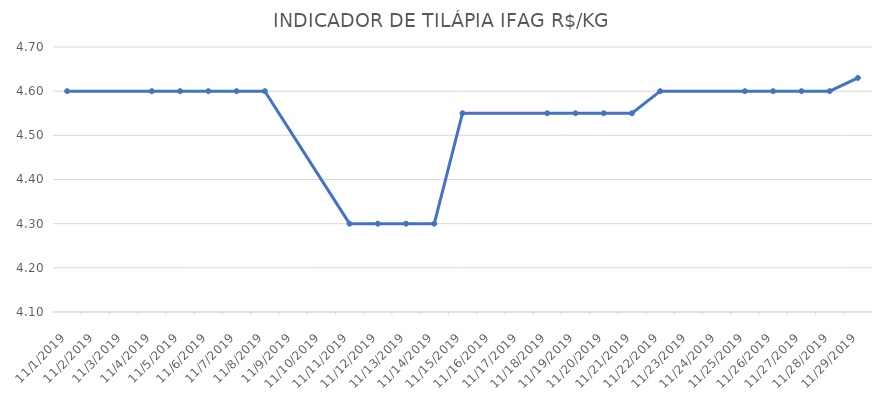
| Category | INDICADOR DE TILÁPIA IFAG |
|---|---|
| 11/1/19 | 4.6 |
| 11/4/19 | 4.6 |
| 11/5/19 | 4.6 |
| 11/6/19 | 4.6 |
| 11/7/19 | 4.6 |
| 11/8/19 | 4.6 |
| 11/11/19 | 4.3 |
| 11/12/19 | 4.3 |
| 11/13/19 | 4.3 |
| 11/14/19 | 4.3 |
| 11/15/19 | 4.55 |
| 11/18/19 | 4.55 |
| 11/19/19 | 4.55 |
| 11/20/19 | 4.55 |
| 11/21/19 | 4.55 |
| 11/22/19 | 4.6 |
| 11/25/19 | 4.6 |
| 11/26/19 | 4.6 |
| 11/27/19 | 4.6 |
| 11/28/19 | 4.6 |
| 11/29/19 | 4.63 |